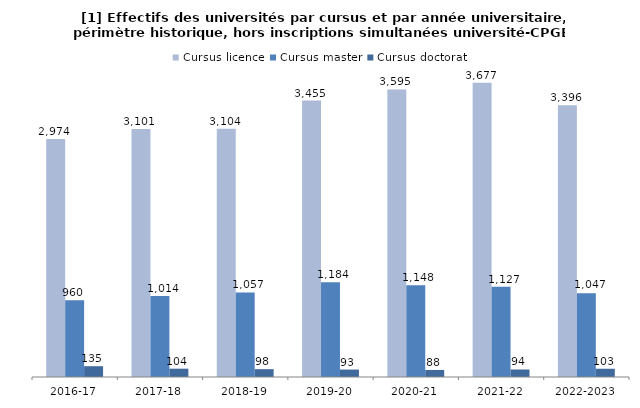
| Category | Cursus licence | Cursus master | Cursus doctorat |
|---|---|---|---|
| 2016-17 | 2974 | 960 | 135 |
| 2017-18 | 3101 | 1014 | 104 |
| 2018-19 | 3104 | 1057 | 98 |
| 2019-20 | 3455 | 1184 | 93 |
| 2020-21 | 3595 | 1148 | 88 |
| 2021-22 | 3677 | 1127 | 94 |
| 2022-2023 | 3396 | 1047 | 103 |